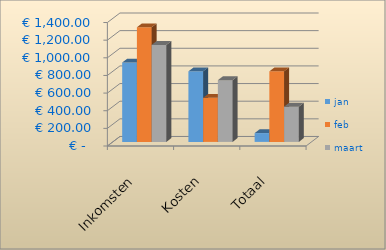
| Category | jan | feb | maart |
|---|---|---|---|
|  Inkomsten  | 900 | 1300 | 1100 |
|  Kosten  | 800 | 500 | 700 |
|  Totaal  | 100 | 800 | 400 |